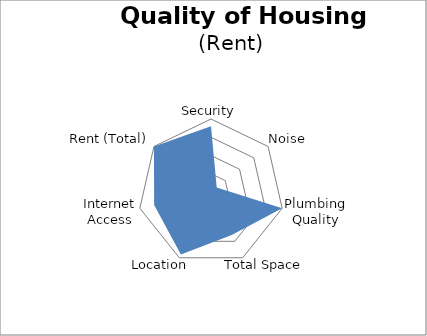
| Category | Rental Ranking |
|---|---|
| Security | 90 |
| Noise | 10 |
| Plumbing Quality | 100 |
| Total Space | 65.53 |
| Location | 95.123 |
| Internet Access | 79.891 |
| Rent (Total) | 100 |